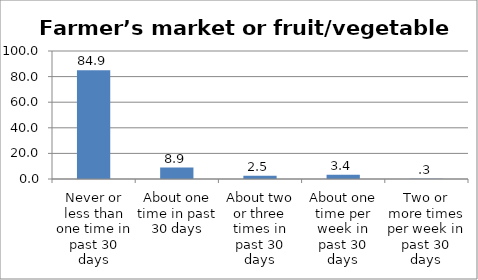
| Category | Series 0 |
|---|---|
| Never or less than one time in past 30 days | 84.903 |
| About one time in past 30 days | 8.935 |
| About two or three times in past 30 days | 2.516 |
| About one time per week in past 30 days | 3.372 |
| Two or more times per week in past 30 days | 0.274 |